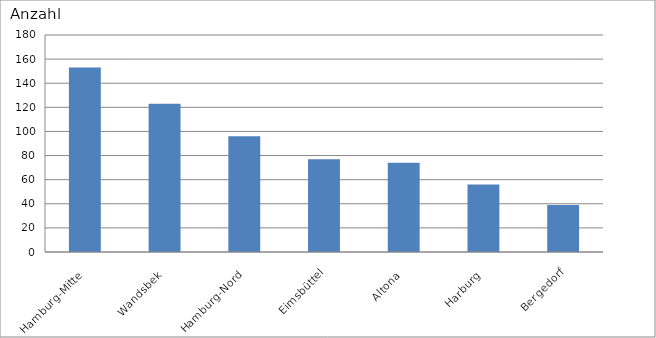
| Category | Hamburg-Mitte |
|---|---|
| Hamburg-Mitte | 153 |
| Wandsbek | 123 |
| Hamburg-Nord | 96 |
| Eimsbüttel | 77 |
| Altona | 74 |
| Harburg | 56 |
| Bergedorf | 39 |